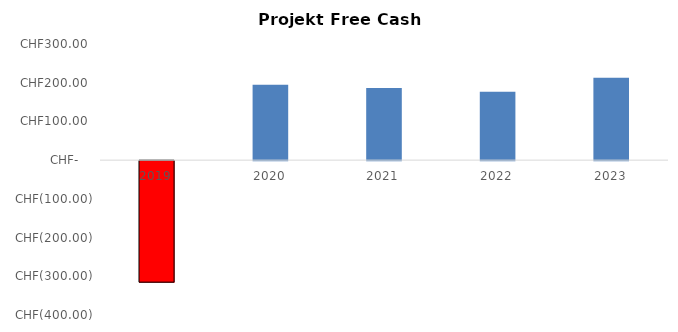
| Category | Projekt Free Cash Flows |
|---|---|
| 2019.0 | -313950 |
| 2020.0 | 194490.333 |
| 2021.0 | 186524.765 |
| 2022.0 | 176833.887 |
| 2023.0 | 212518.508 |